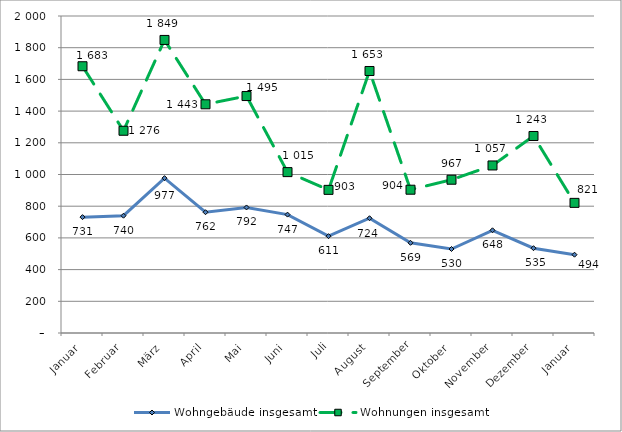
| Category | Wohngebäude insgesamt | Wohnungen insgesamt |
|---|---|---|
| Januar | 731 | 1683 |
| Februar | 740 | 1276 |
| März | 977 | 1849 |
| April | 762 | 1443 |
| Mai | 792 | 1495 |
| Juni | 747 | 1015 |
| Juli | 611 | 903 |
| August | 724 | 1653 |
| September | 569 | 904 |
| Oktober | 530 | 967 |
| November | 648 | 1057 |
| Dezember | 535 | 1243 |
| Januar | 494 | 821 |